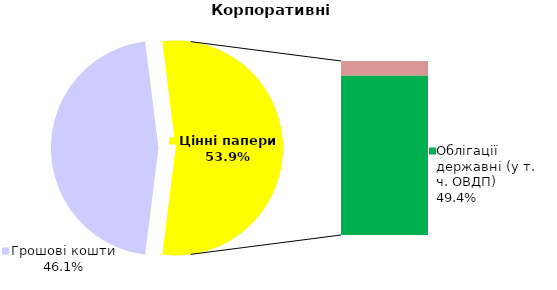
| Category | Корпоративні |
|---|---|
| Грошові кошти | 110.476 |
| Банківські метали | 0 |
| Нерухомість | 0 |
| Інші активи | 0 |
| Акції | 0.049 |
| Облігації підприємств | 10.854 |
| Муніципальні облігації | 0 |
| Облігації державні (у т. ч. ОВДП) | 118.49 |